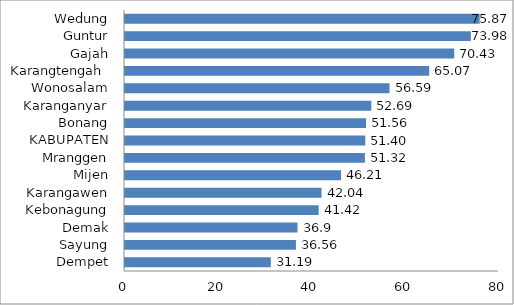
| Category | Series 0 |
|---|---|
| Dempet | 31.19 |
| Sayung | 36.56 |
| Demak | 36.9 |
| Kebonagung | 41.42 |
| Karangawen | 42.04 |
| Mijen | 46.21 |
| Mranggen | 51.32 |
| KABUPATEN | 51.4 |
| Bonang | 51.56 |
| Karanganyar | 52.69 |
| Wonosalam | 56.59 |
| Karangtengah  | 65.07 |
| Gajah | 70.43 |
| Guntur | 73.98 |
| Wedung | 75.87 |